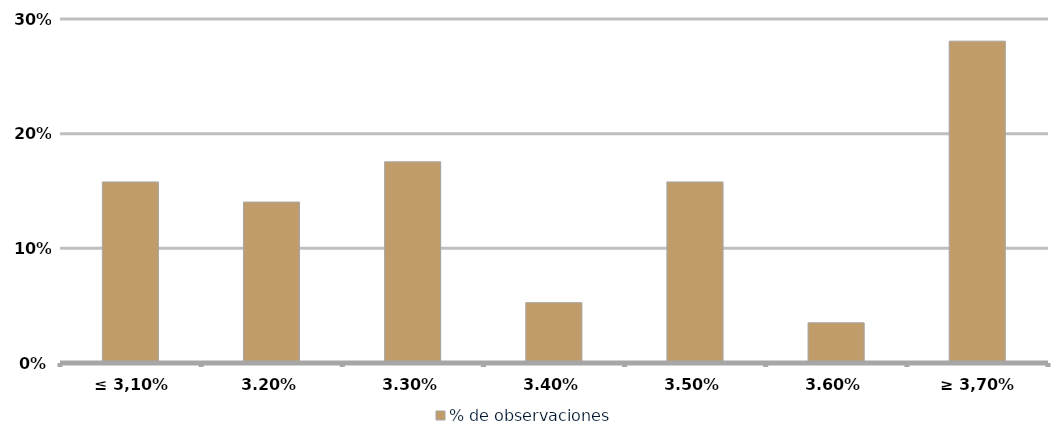
| Category | % de observaciones  |
|---|---|
| ≤ 3,10% | 0.158 |
| 3,20% | 0.14 |
| 3,30% | 0.175 |
| 3,40% | 0.053 |
| 3,50% | 0.158 |
| 3,60% | 0.035 |
| ≥ 3,70% | 0.281 |